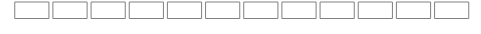
| Category | Dummy100Pct | Series 0 |
|---|---|---|
| 0 |  | 0.004 |
| 1 |  | 0.006 |
| 2 |  | 0.004 |
| 3 |  | 0.005 |
| 4 |  | 0.004 |
| 5 |  | 0.003 |
| 6 |  | 0.004 |
| 7 |  | 0.003 |
| 8 |  | 0.004 |
| 9 |  | 0.002 |
| 10 |  | 0.004 |
| 11 |  | 0.004 |